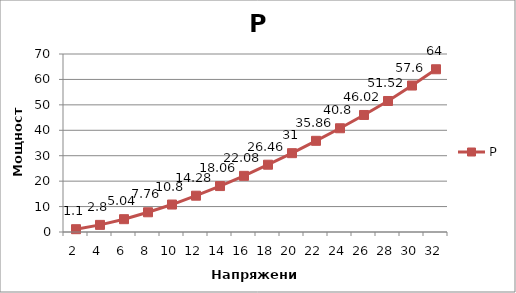
| Category | P |
|---|---|
| 2.0 | 1.1 |
| 4.0 | 2.8 |
| 6.0 | 5.04 |
| 8.0 | 7.76 |
| 10.0 | 10.8 |
| 12.0 | 14.28 |
| 14.0 | 18.06 |
| 16.0 | 22.08 |
| 18.0 | 26.46 |
| 20.0 | 31 |
| 22.0 | 35.86 |
| 24.0 | 40.8 |
| 26.0 | 46.02 |
| 28.0 | 51.52 |
| 30.0 | 57.6 |
| 32.0 | 64 |